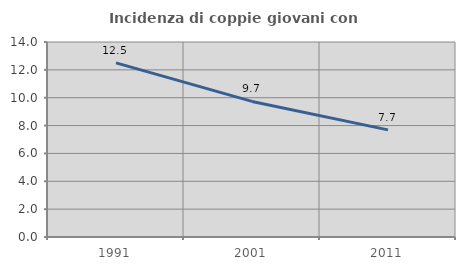
| Category | Incidenza di coppie giovani con figli |
|---|---|
| 1991.0 | 12.5 |
| 2001.0 | 9.735 |
| 2011.0 | 7.692 |